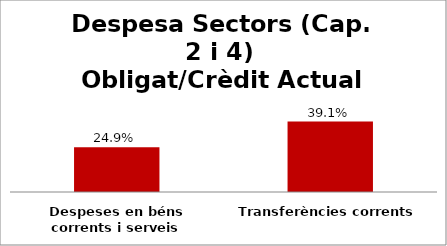
| Category | Series 0 |
|---|---|
| Despeses en béns corrents i serveis | 0.249 |
| Transferències corrents | 0.391 |